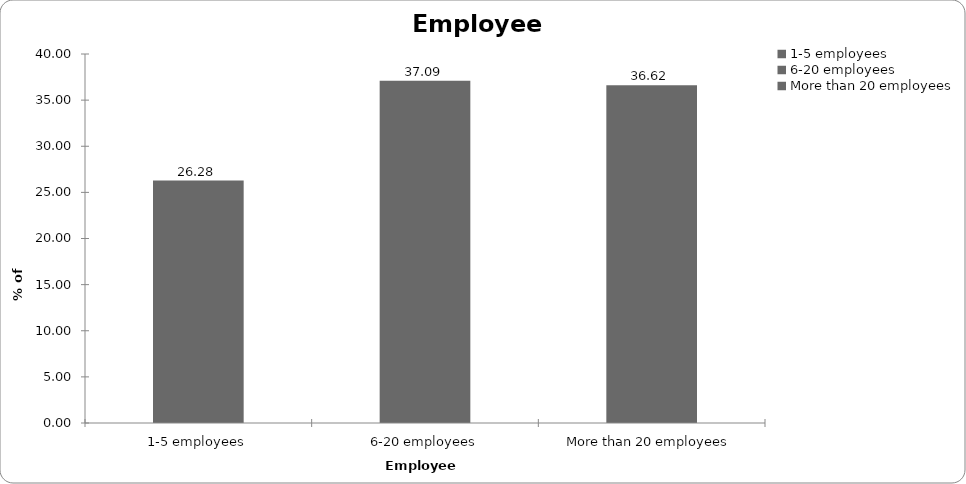
| Category | Employees |
|---|---|
| 1-5 employees | 26.284 |
| 6-20 employees | 37.091 |
| More than 20 employees | 36.624 |